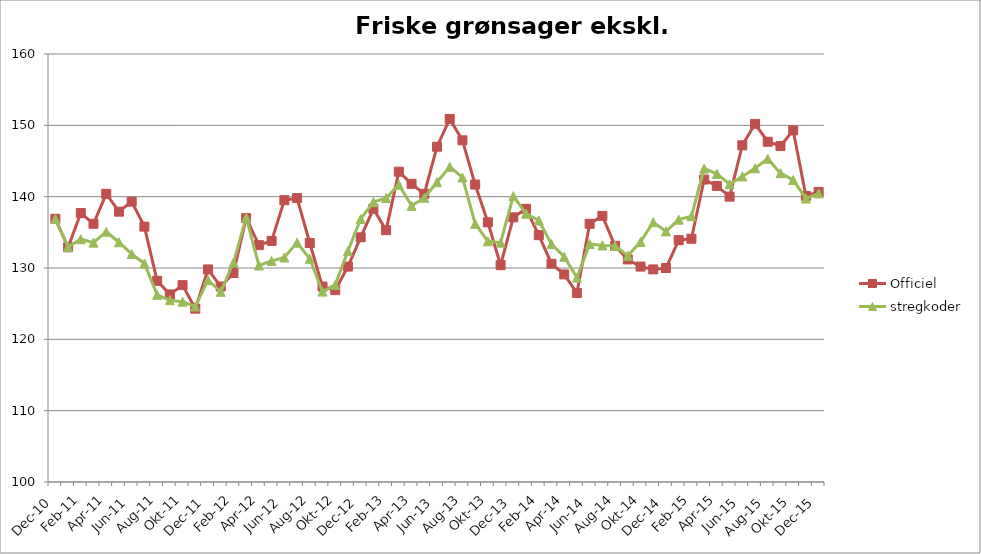
| Category | Officiel | stregkoder |
|---|---|---|
|  Dec-10 | 136.9 | 136.894 |
|  Jan-11 | 132.9 | 132.95 |
|  Feb-11 | 137.7 | 134.034 |
|  Mar-11 | 136.2 | 133.557 |
|  Apr-11 | 140.4 | 135.086 |
|  Maj-11 | 137.9 | 133.61 |
|  Jun-11 | 139.3 | 131.952 |
|  Jul-11 | 135.8 | 130.627 |
|  Aug-11 | 128.2 | 126.237 |
|  Sep-11 | 126.3 | 125.489 |
|  Okt-11 | 127.6 | 125.272 |
|  Nov-11 | 124.3 | 124.605 |
|  Dec-11 | 129.8 | 128.318 |
|  Jan-12 | 127.4 | 126.662 |
|  Feb-12 | 129.3 | 130.765 |
|  Mar-12 | 137 | 137.091 |
|  Apr-12 | 133.2 | 130.347 |
|  Maj-12 | 133.8 | 130.987 |
|  Jun-12 | 139.5 | 131.473 |
|  Jul-12 | 139.8 | 133.555 |
|  Aug-12 | 133.5 | 131.294 |
|  Sep-12 | 127.4 | 126.694 |
|  Okt-12 | 126.9 | 127.644 |
|  Nov-12 | 130.2 | 132.374 |
|  Dec-12 | 134.3 | 136.875 |
|  Jan-13 | 138.3 | 139.237 |
|  Feb-13 | 135.3 | 139.808 |
|  Mar-13 | 143.5 | 141.67 |
|  Apr-13 | 141.8 | 138.722 |
|  Maj-13 | 140.4 | 139.844 |
|  Jun-13 | 147 | 142.03 |
|  Jul-13 | 150.9 | 144.178 |
|  Aug-13 | 147.9 | 142.694 |
|  Sep-13 | 141.7 | 136.203 |
|  Okt-13 | 136.4 | 133.741 |
|  Nov-13 | 130.4 | 133.556 |
|  Dec-13 | 137.1 | 140.09 |
|  Jan-14 | 138.3 | 137.598 |
|  Feb-14 | 134.6 | 136.67 |
|  Mar-14 | 130.6 | 133.351 |
|  Apr-14 | 129.1 | 131.576 |
|  Maj-14 | 126.5 | 128.659 |
|  Jun-14 | 136.2 | 133.37 |
|  Jul-14 | 137.3 | 133.167 |
|  Aug-14 | 133.1 | 133.112 |
|  Sep-14 | 131.2 | 131.706 |
|  Okt-14 | 130.2 | 133.663 |
|  Nov-14 | 129.8 | 136.419 |
|  Dec-14 | 130 | 135.133 |
|  Jan-15 | 133.9 | 136.779 |
|  Feb-15 | 134.1 | 137.259 |
|  Mar-15 | 142.4 | 143.937 |
|  Apr-15 | 141.5 | 143.203 |
|  Maj-15 | 140 | 141.746 |
| Jun-15 | 147.2 | 142.838 |
| Jul-15 | 150.2 | 143.987 |
| Aug-15 | 147.7 | 145.303 |
| Sep-15 | 147.1 | 143.29 |
| Okt-15 | 149.3 | 142.337 |
| Nov-15 | 140.1 | 139.736 |
| Dec-15 | 140.67 | 140.463 |